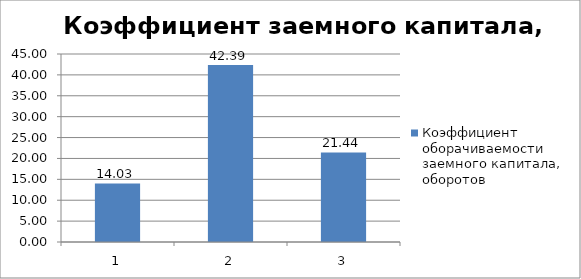
| Category | Коэффициент оборачиваемости заемного капитала, оборотов |
|---|---|
| 0 | 14.032 |
| 1 | 42.393 |
| 2 | 21.442 |